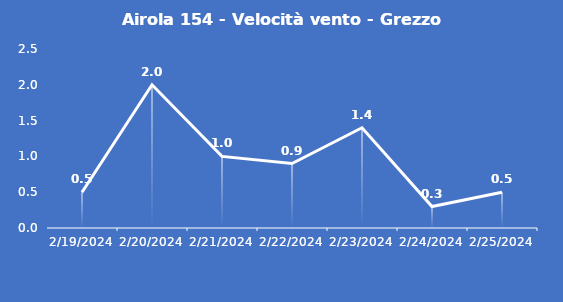
| Category | Airola 154 - Velocità vento - Grezzo (m/s) |
|---|---|
| 2/19/24 | 0.5 |
| 2/20/24 | 2 |
| 2/21/24 | 1 |
| 2/22/24 | 0.9 |
| 2/23/24 | 1.4 |
| 2/24/24 | 0.3 |
| 2/25/24 | 0.5 |